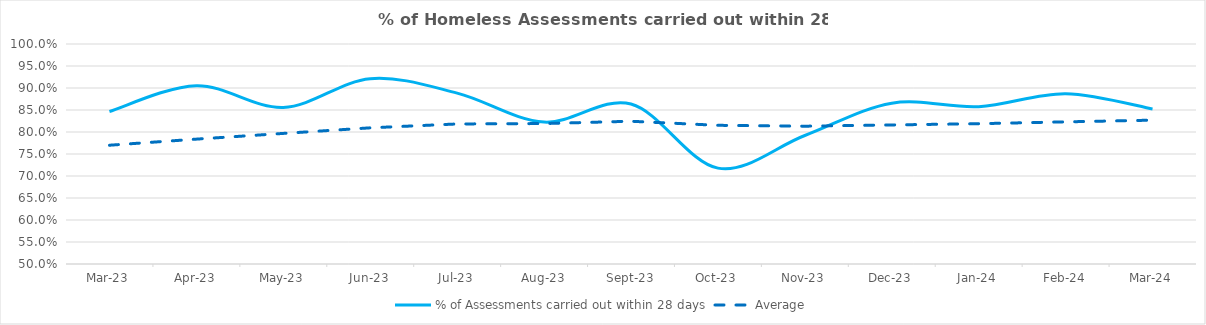
| Category | % of Assessments carried out within 28 days | Average |
|---|---|---|
| 2023-03-01 | 0.847 | 0.77 |
| 2023-04-01 | 0.905 | 0.784 |
| 2023-05-01 | 0.856 | 0.797 |
| 2023-06-01 | 0.921 | 0.809 |
| 2023-07-01 | 0.888 | 0.818 |
| 2023-08-01 | 0.823 | 0.819 |
| 2023-09-01 | 0.863 | 0.824 |
| 2023-10-01 | 0.718 | 0.815 |
| 2023-11-01 | 0.792 | 0.813 |
| 2023-12-01 | 0.866 | 0.816 |
| 2024-01-01 | 0.858 | 0.819 |
| 2024-02-01 | 0.887 | 0.823 |
| 2024-03-01 | 0.852 | 0.827 |